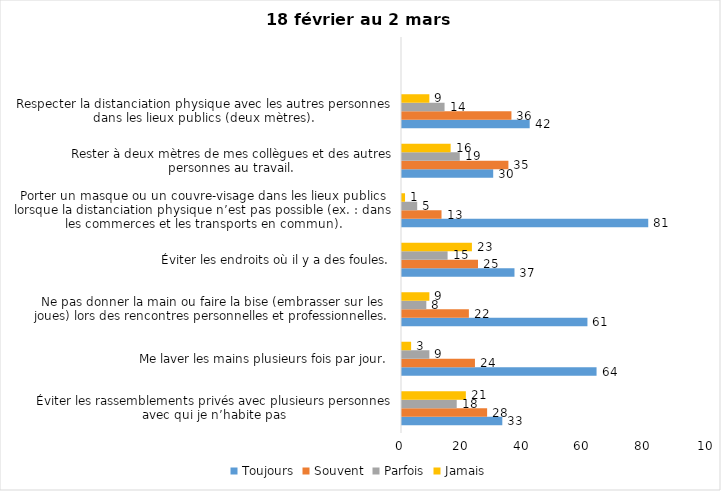
| Category | Toujours | Souvent | Parfois | Jamais |
|---|---|---|---|---|
| Éviter les rassemblements privés avec plusieurs personnes avec qui je n’habite pas | 33 | 28 | 18 | 21 |
| Me laver les mains plusieurs fois par jour. | 64 | 24 | 9 | 3 |
| Ne pas donner la main ou faire la bise (embrasser sur les joues) lors des rencontres personnelles et professionnelles. | 61 | 22 | 8 | 9 |
| Éviter les endroits où il y a des foules. | 37 | 25 | 15 | 23 |
| Porter un masque ou un couvre-visage dans les lieux publics lorsque la distanciation physique n’est pas possible (ex. : dans les commerces et les transports en commun). | 81 | 13 | 5 | 1 |
| Rester à deux mètres de mes collègues et des autres personnes au travail. | 30 | 35 | 19 | 16 |
| Respecter la distanciation physique avec les autres personnes dans les lieux publics (deux mètres). | 42 | 36 | 14 | 9 |